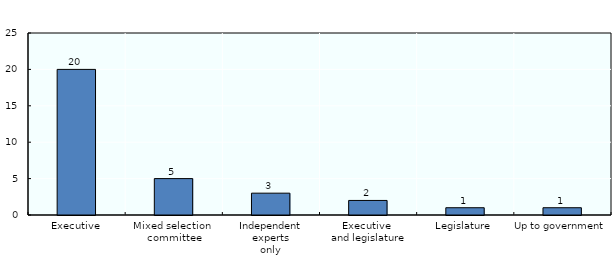
| Category | Agency that nominates board and chair |
|---|---|
| Executive | 20 |
| Mixed selection 
committee | 5 |
| Independent experts
only | 3 |
| Executive 
and legislature | 2 |
| Legislature | 1 |
| Up to government | 1 |